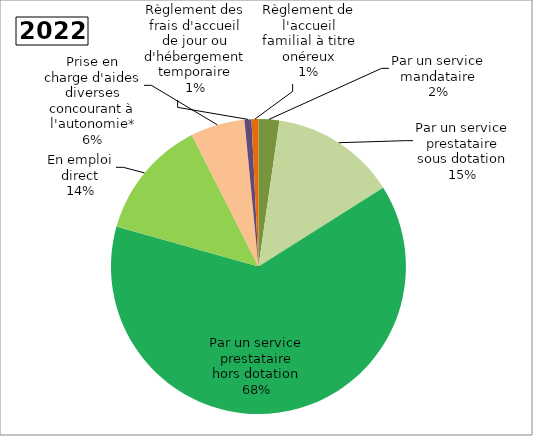
| Category | Series 0 |
|---|---|
| Par un service mandataire | 0.025 |
| Par un service prestataire sous dotation | 0.149 |
| Par un service prestataire hors dotation | 0.684 |
| En emploi direct | 0.142 |
| Prise en charge d'aides diverses concourant à l'autonomie* | 0.064 |
| Règlement des frais d'accueil de jour ou d'hébergement temporaire | 0.008 |
| Règlement de l'accueil familial à titre onéreux | 0.008 |